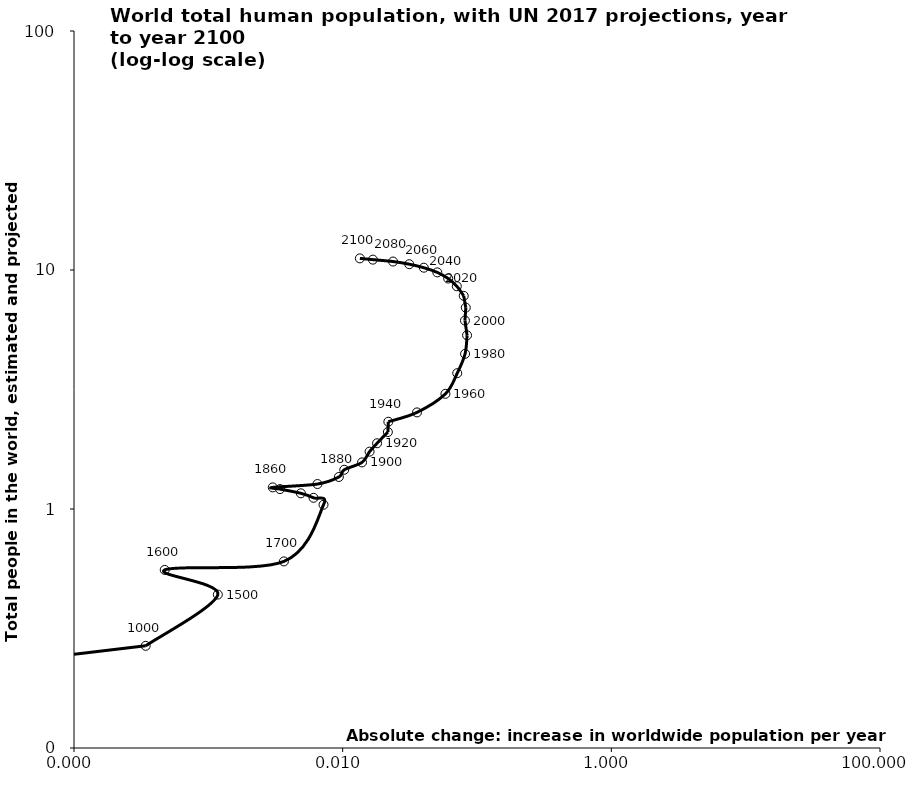
| Category | Series 0 |
|---|---|
| 3.6753000000000005e-05 | 0.231 |
| 0.00034170999999999995 | 0.268 |
| 0.0011772 | 0.438 |
| 0.00047341999999999995 | 0.556 |
| 0.003652866666666666 | 0.603 |
| 0.007202922348725549 | 1.042 |
| 0.006066851472580759 | 1.114 |
| 0.004885489039188495 | 1.163 |
| 0.0034150005009054964 | 1.212 |
| 0.003017099786448729 | 1.231 |
| 0.006489837157338985 | 1.272 |
| 0.009368038995913453 | 1.361 |
| 0.010276072585718443 | 1.459 |
| 0.013933965678965122 | 1.567 |
| 0.015861353266234546 | 1.738 |
| 0.01803809098330276 | 1.884 |
| 0.021703395935288017 | 2.099 |
| 0.021877890391818665 | 2.318 |
| 0.03575641543193375 | 2.536 |
| 0.05821514645000001 | 3.033 |
| 0.07125995034999999 | 3.701 |
| 0.0815182905 | 4.458 |
| 0.08432977275 | 5.331 |
| 0.08136128494999997 | 6.145 |
| 0.082523766 | 6.958 |
| 0.07965147424999999 | 7.795 |
| 0.07074273475 | 8.551 |
| 0.06103120545000005 | 9.21 |
| 0.050613073249999994 | 9.772 |
| 0.04020118989999997 | 10.223 |
| 0.03130548575000001 | 10.576 |
| 0.023710432100000033 | 10.849 |
| 0.016782976849999985 | 11.05 |
| 0.013431252799999882 | 11.184 |